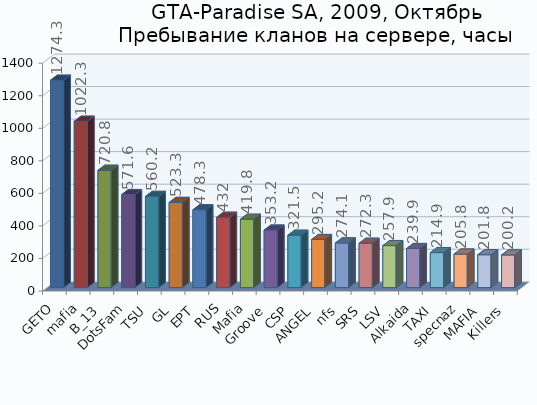
| Category | Series 0 |
|---|---|
| GETO | 1274.3 |
| mafia | 1022.3 |
| B_13 | 720.8 |
| DotsFam | 571.6 |
| TSU | 560.2 |
| GL | 523.3 |
| EPT | 478.3 |
| RUS | 432 |
| Mafia | 419.8 |
| Groove | 353.2 |
| CSP | 321.5 |
| ANGEL | 295.2 |
| nfs | 274.1 |
| SRS | 272.3 |
| LSV | 257.9 |
| Alkaida | 239.9 |
| TAXI | 214.9 |
| specnaz | 205.8 |
| MAFIA | 201.8 |
| Killers | 200.2 |